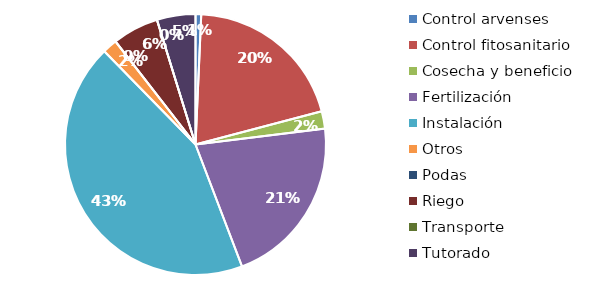
| Category | Valor |
|---|---|
| Control arvenses | 795879 |
| Control fitosanitario | 22869516 |
| Cosecha y beneficio | 2422395.948 |
| Fertilización | 23941473 |
| Instalación | 49204917.687 |
| Otros | 2054710 |
| Podas | 0 |
| Riego | 6488561 |
| Transporte | 0 |
| Tutorado | 5407134 |